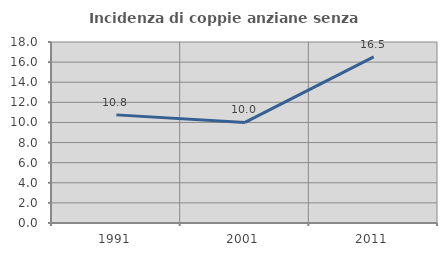
| Category | Incidenza di coppie anziane senza figli  |
|---|---|
| 1991.0 | 10.753 |
| 2001.0 | 10 |
| 2011.0 | 16.522 |